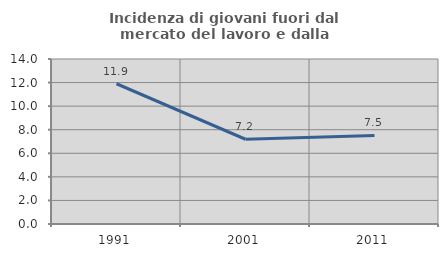
| Category | Incidenza di giovani fuori dal mercato del lavoro e dalla formazione  |
|---|---|
| 1991.0 | 11.9 |
| 2001.0 | 7.191 |
| 2011.0 | 7.512 |